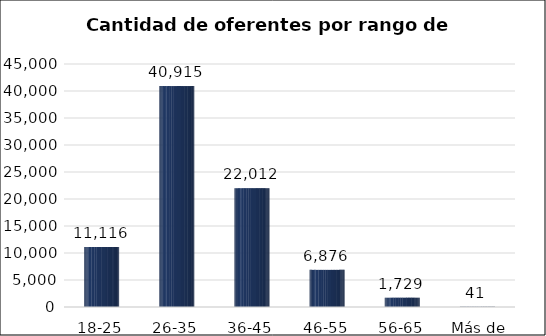
| Category | Cantidad de oferentes |
|---|---|
| 18-25 | 11116 |
| 26-35 | 40915 |
| 36-45 | 22012 |
| 46-55 | 6876 |
| 56-65 | 1729 |
| Más de 65 | 41 |